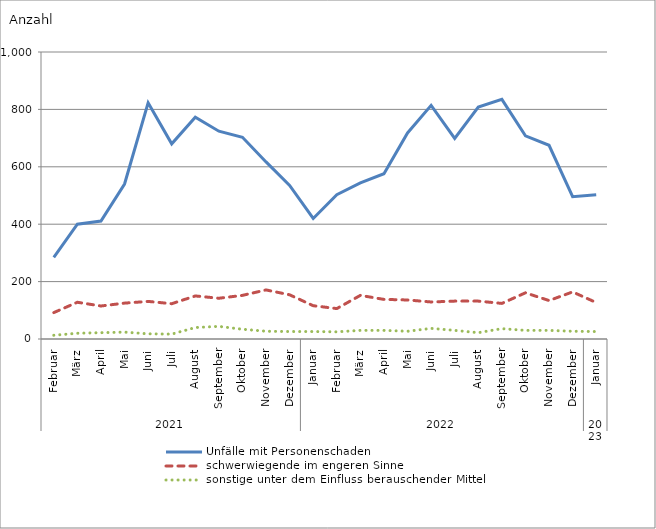
| Category | Unfälle mit Personenschaden | schwerwiegende im engeren Sinne | sonstige unter dem Einfluss berauschender Mittel |
|---|---|---|---|
| 0 | 284 | 92 | 13 |
| 1 | 400 | 128 | 20 |
| 2 | 411 | 115 | 22 |
| 3 | 540 | 125 | 24 |
| 4 | 823 | 131 | 18 |
| 5 | 680 | 123 | 17 |
| 6 | 773 | 150 | 40 |
| 7 | 724 | 142 | 44 |
| 8 | 703 | 152 | 34 |
| 9 | 617 | 171 | 27 |
| 10 | 535 | 154 | 26 |
| 11 | 420 | 116 | 26 |
| 12 | 503 | 106 | 25 |
| 13 | 544 | 152 | 30 |
| 14 | 576 | 138 | 30 |
| 15 | 718 | 136 | 27 |
| 16 | 814 | 129 | 37 |
| 17 | 699 | 132 | 30 |
| 18 | 808 | 132 | 22 |
| 19 | 835 | 124 | 36 |
| 20 | 708 | 161 | 30 |
| 21 | 675 | 134 | 30 |
| 22 | 496 | 164 | 27 |
| 23 | 503 | 127 | 26 |